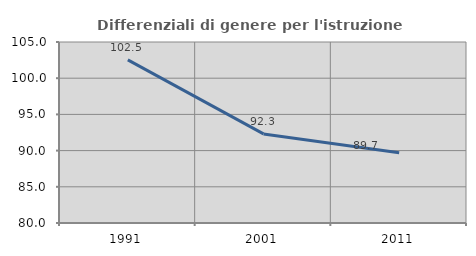
| Category | Differenziali di genere per l'istruzione superiore |
|---|---|
| 1991.0 | 102.526 |
| 2001.0 | 92.303 |
| 2011.0 | 89.703 |